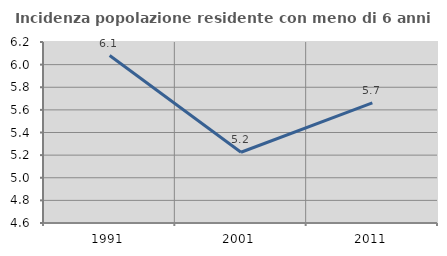
| Category | Incidenza popolazione residente con meno di 6 anni |
|---|---|
| 1991.0 | 6.08 |
| 2001.0 | 5.225 |
| 2011.0 | 5.663 |